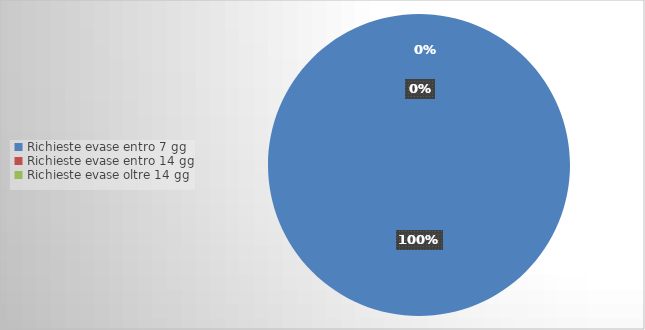
| Category | Series 0 |
|---|---|
| Richieste evase entro 7 gg | 43 |
| Richieste evase entro 14 gg | 0 |
| Richieste evase oltre 14 gg | 0 |